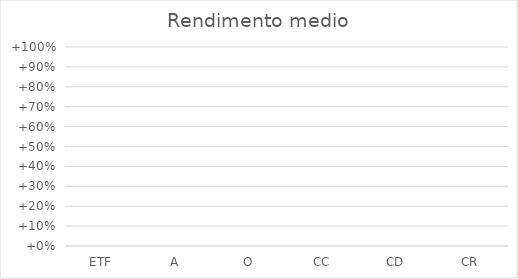
| Category | Rendimento medio |
|---|---|
| ETF | 0 |
| A | 0 |
| O | 0 |
| CC | 0 |
| CD | 0 |
| CR | 0 |